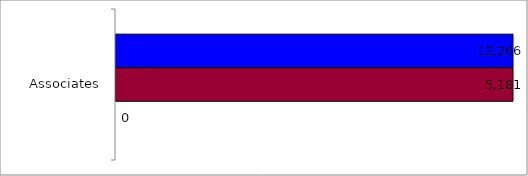
| Category | 50 states and D.C. | SREB states | State |
|---|---|---|---|
| Associates | 12266 | 5181 | 0 |